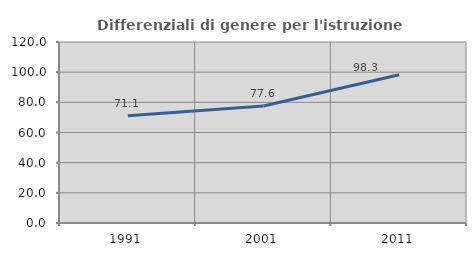
| Category | Differenziali di genere per l'istruzione superiore |
|---|---|
| 1991.0 | 71.125 |
| 2001.0 | 77.556 |
| 2011.0 | 98.266 |